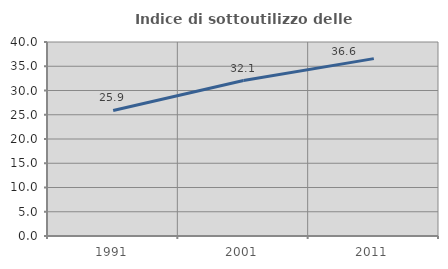
| Category | Indice di sottoutilizzo delle abitazioni  |
|---|---|
| 1991.0 | 25.894 |
| 2001.0 | 32.05 |
| 2011.0 | 36.57 |